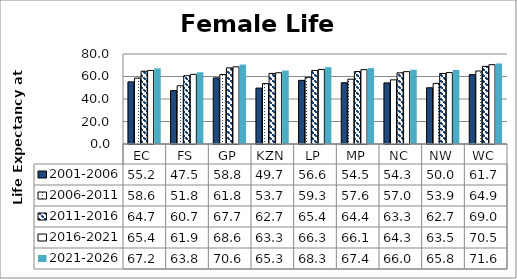
| Category | 2001-2006 | 2006-2011 | 2011-2016 | 2016-2021 | 2021-2026 |
|---|---|---|---|---|---|
| EC | 55.226 | 58.579 | 64.695 | 65.401 | 67.219 |
| FS | 47.459 | 51.753 | 60.703 | 61.914 | 63.782 |
| GP | 58.777 | 61.787 | 67.671 | 68.61 | 70.624 |
| KZN | 49.695 | 53.66 | 62.739 | 63.327 | 65.292 |
| LP | 56.56 | 59.278 | 65.354 | 66.282 | 68.321 |
| MP | 54.453 | 57.624 | 64.395 | 66.123 | 67.436 |
| NC | 54.3 | 57.011 | 63.273 | 64.315 | 65.985 |
| NW | 49.986 | 53.883 | 62.668 | 63.47 | 65.784 |
| WC | 61.666 | 64.916 | 69.037 | 70.525 | 71.573 |